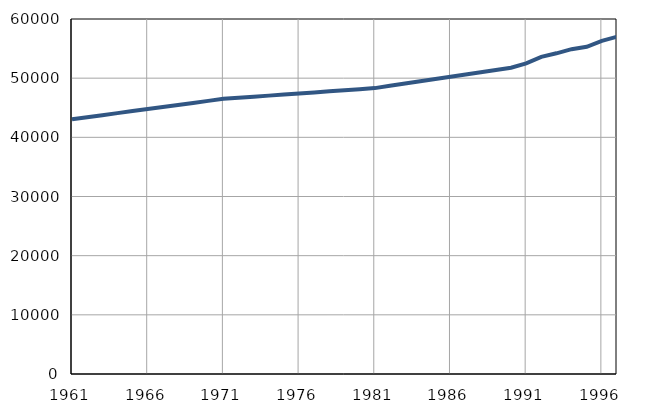
| Category | Population
size |
|---|---|
| 1961.0 | 43058 |
| 1962.0 | 43403 |
| 1963.0 | 43748 |
| 1964.0 | 44093 |
| 1965.0 | 44438 |
| 1966.0 | 44783 |
| 1967.0 | 45128 |
| 1968.0 | 45473 |
| 1969.0 | 45818 |
| 1970.0 | 46163 |
| 1971.0 | 46504 |
| 1972.0 | 46686 |
| 1973.0 | 46868 |
| 1974.0 | 47050 |
| 1975.0 | 47232 |
| 1976.0 | 47414 |
| 1977.0 | 47596 |
| 1978.0 | 47778 |
| 1979.0 | 47960 |
| 1980.0 | 48142 |
| 1981.0 | 48320 |
| 1982.0 | 48703 |
| 1983.0 | 49086 |
| 1984.0 | 49469 |
| 1985.0 | 49852 |
| 1986.0 | 50235 |
| 1987.0 | 50618 |
| 1988.0 | 51001 |
| 1989.0 | 51384 |
| 1990.0 | 51767 |
| 1991.0 | 52500 |
| 1992.0 | 53600 |
| 1993.0 | 54200 |
| 1994.0 | 54900 |
| 1995.0 | 55300 |
| 1996.0 | 56300 |
| 1997.0 | 57000 |